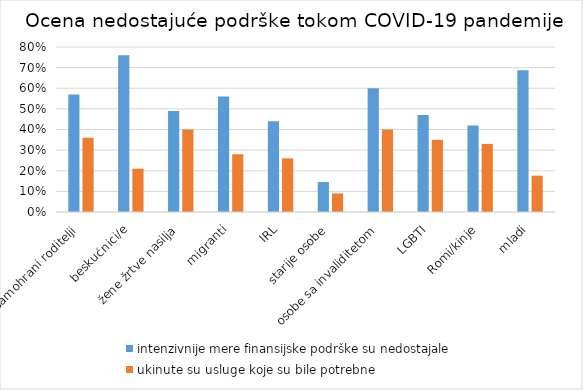
| Category | intenzivnije mere finansijske podrške su nedostajale | ukinute su usluge koje su bile potrebne |
|---|---|---|
| samohrani roditelji | 0.57 | 0.36 |
| beskućnici/e | 0.76 | 0.21 |
| žene žrtve nasilja | 0.49 | 0.4 |
| migranti | 0.56 | 0.28 |
| IRL | 0.44 | 0.26 |
| starije osobe | 0.145 | 0.09 |
| osobe sa invaliditetom | 0.6 | 0.4 |
| LGBTI | 0.47 | 0.35 |
| Romi/kinje | 0.42 | 0.33 |
| mladi | 0.687 | 0.176 |